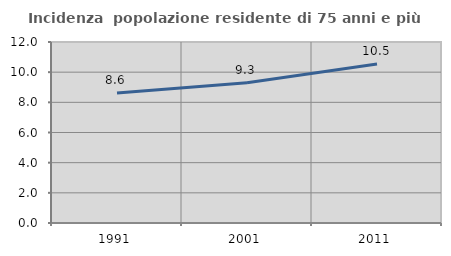
| Category | Incidenza  popolazione residente di 75 anni e più |
|---|---|
| 1991.0 | 8.618 |
| 2001.0 | 9.303 |
| 2011.0 | 10.539 |